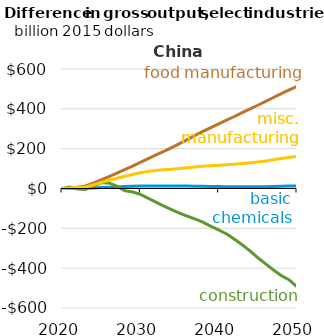
| Category | Basic chemicals | Food manufacturing | Construction | Misc. Manufacturing |
|---|---|---|---|---|
| 2020.0 | 0 | 0 | 0 | 0 |
| 2021.0 | 0.443 | 1.462 | 7.686 | 2.08 |
| 2022.0 | 1.062 | 6.349 | -2.658 | 5.747 |
| 2023.0 | 1.145 | 13.232 | -4.803 | 7.809 |
| 2024.0 | 2.583 | 26.815 | 12.738 | 17.452 |
| 2025.0 | 4.458 | 43.218 | 28.641 | 29.914 |
| 2026.0 | 6.173 | 59.963 | 27.793 | 41.447 |
| 2027.0 | 7.814 | 76.881 | 11.718 | 51.786 |
| 2028.0 | 9.465 | 94.371 | -11.012 | 61.38 |
| 2029.0 | 10.915 | 112.746 | -17.332 | 70.636 |
| 2030.0 | 12.01 | 131.468 | -29.511 | 78.767 |
| 2031.0 | 12.703 | 150.087 | -49.149 | 85.243 |
| 2032.0 | 13.042 | 168.772 | -68.477 | 90.437 |
| 2033.0 | 12.876 | 186.836 | -88.217 | 93.742 |
| 2034.0 | 12.575 | 205.631 | -106.382 | 96.852 |
| 2035.0 | 12.243 | 225.3 | -123.79 | 100.182 |
| 2036.0 | 11.932 | 245.712 | -139.05 | 103.949 |
| 2037.0 | 11.636 | 266.392 | -153.1 | 108.059 |
| 2038.0 | 11.202 | 286.409 | -169.38 | 111.657 |
| 2039.0 | 10.535 | 305.288 | -189.79 | 114.189 |
| 2040.0 | 9.856 | 324.08 | -208.1 | 116.659 |
| 2041.0 | 9.285 | 342.875 | -227.82 | 119.451 |
| 2042.0 | 8.81 | 361.579 | -254.24 | 122.307 |
| 2043.0 | 8.551 | 380.552 | -282.46 | 125.653 |
| 2044.0 | 8.496 | 399.424 | -313.27 | 129.351 |
| 2045.0 | 8.611 | 418.074 | -347.8 | 133.209 |
| 2046.0 | 9.114 | 437.369 | -378.52 | 138.245 |
| 2047.0 | 10.026 | 457.007 | -409.42 | 144.453 |
| 2048.0 | 11.093 | 476.315 | -437.52 | 150.906 |
| 2049.0 | 11.955 | 494.913 | -458.71 | 156.66 |
| 2050.0 | 12.713 | 512.129 | -493.41 | 161.574 |